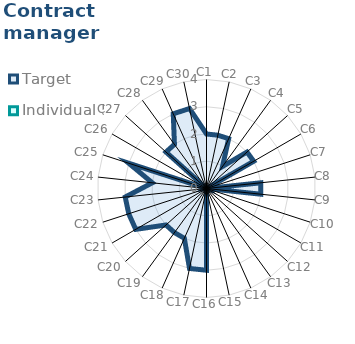
| Category | Target | Individual 5 |
|---|---|---|
| C1 | 2 | 0 |
| C2 | 2 | 0 |
| C3 | 2 | 0 |
| C4 | 1 | 0 |
| C5 | 2 | 0 |
| C6 | 2 | 0 |
| C7 | 0 | 0 |
| C8 | 2 | 0 |
| C9 | 2 | 0 |
| C10 | 0 | 0 |
| C11 | 0 | 0 |
| C12 | 0 | 0 |
| C13 | 0 | 0 |
| C14 | 0 | 0 |
| C15 | 0 | 0 |
| C16 | 3 | 0 |
| C17 | 3 | 0 |
| C18 | 2 | 0 |
| C19 | 2 | 0 |
| C20 | 2 | 0 |
| C21 | 3 | 0 |
| C22 | 3 | 0 |
| C23 | 3 | 0 |
| C24 | 2 | 0 |
| C25 | 3 | 0 |
| C26 | 0 | 0 |
| C27 | 2 | 0 |
| C28 | 2 | 0 |
| C29 | 3 | 0 |
| C30 | 3 | 0 |